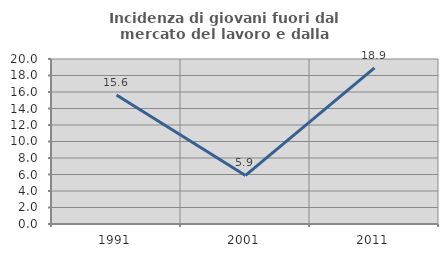
| Category | Incidenza di giovani fuori dal mercato del lavoro e dalla formazione  |
|---|---|
| 1991.0 | 15.625 |
| 2001.0 | 5.882 |
| 2011.0 | 18.919 |